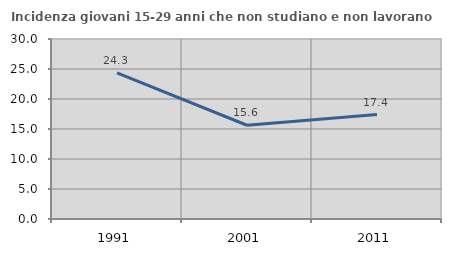
| Category | Incidenza giovani 15-29 anni che non studiano e non lavorano  |
|---|---|
| 1991.0 | 24.348 |
| 2001.0 | 15.625 |
| 2011.0 | 17.403 |